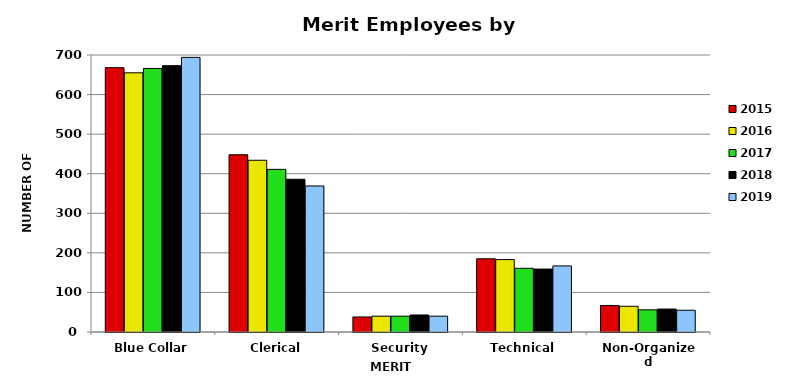
| Category | 2015 | 2016 | 2017 | 2018 | 2019 |
|---|---|---|---|---|---|
| Blue Collar | 668 | 655 | 666 | 673 | 694 |
| Clerical | 448 | 434 | 411 | 386 | 369 |
| Security | 38 | 40 | 40 | 43 | 40 |
| Technical | 185 | 183 | 161 | 159 | 167 |
| Non-Organized | 67 | 65 | 56 | 58 | 55 |